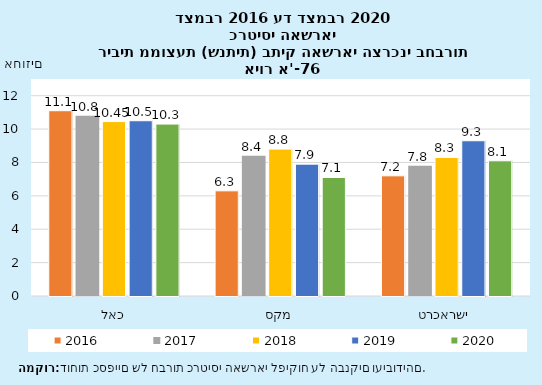
| Category | 2016 | 2017 | 2018 | 2019 | 2020 |
|---|---|---|---|---|---|
| כאל | 11.1 | 10.8 | 10.45 | 10.5 | 10.3 |
| מקס | 6.3 | 8.4 | 8.8 | 7.9 | 7.1 |
| ישראכרט | 7.2 | 7.8 | 8.3 | 9.3 | 8.1 |